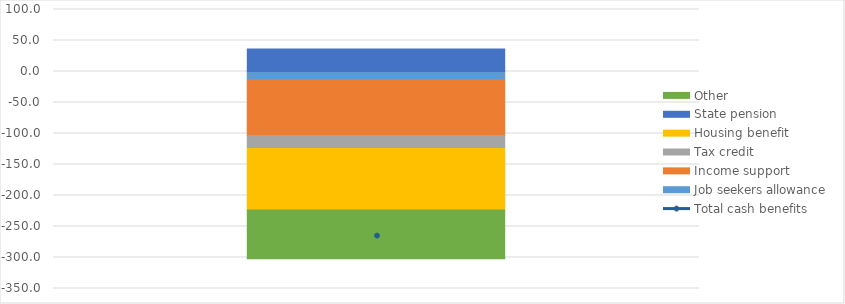
| Category | Job seekers allowance | Income support | Tax credit | Housing benefit | State pension | Other |
|---|---|---|---|---|---|---|
| Change in average | -13.3 | -89.8 | -20.9 | -99.3 | 36.3 | -78.6 |